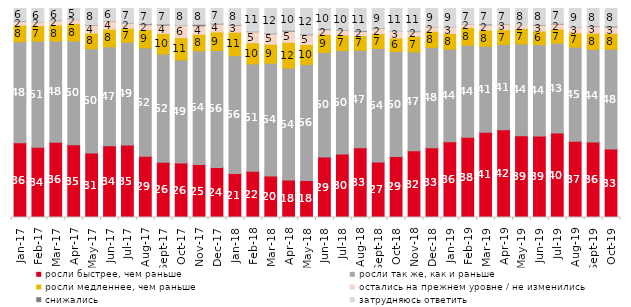
| Category | росли быстрее, чем раньше | росли так же, как и раньше | росли медленнее, чем раньше | остались на прежнем уровне / не изменились | снижались | затрудняюсь ответить |
|---|---|---|---|---|---|---|
| 2017-01-01 | 35.75 | 48.35 | 7.9 | 1.95 | 0.15 | 5.9 |
| 2017-02-01 | 33.65 | 50.75 | 7.45 | 1.8 | 0.1 | 6.25 |
| 2017-03-01 | 36 | 48.45 | 7.65 | 2.1 | 0.2 | 5.6 |
| 2017-04-01 | 34.85 | 49.65 | 8.35 | 1.85 | 0.1 | 5.2 |
| 2017-05-01 | 30.9 | 49.8 | 7.5 | 3.9 | 0.2 | 7.7 |
| 2017-06-01 | 34.3 | 47.4 | 8.4 | 3.95 | 0.15 | 5.8 |
| 2017-07-01 | 34.65 | 49.2 | 6.7 | 2.3 | 0.15 | 7 |
| 2017-08-01 | 29.3 | 51.9 | 8.65 | 2.4 | 0.45 | 7.3 |
| 2017-09-01 | 26.4 | 51.8 | 9.85 | 4 | 0.5 | 7.45 |
| 2017-10-01 | 26.1 | 49.3 | 10.65 | 5.8 | 0.15 | 8 |
| 2017-11-01 | 25.35 | 54.4 | 7.9 | 4.05 | 0.75 | 7.55 |
| 2017-12-01 | 23.95 | 55.95 | 8.9 | 3.8 | 0.3 | 7.1 |
| 2018-01-01 | 21.1 | 56.35 | 11.2 | 3.35 | 0.25 | 7.75 |
| 2018-02-01 | 22.1 | 51.4 | 10.1 | 5.3 | 0.2 | 10.9 |
| 2018-03-01 | 19.8 | 54 | 9.1 | 5.05 | 0.25 | 11.8 |
| 2018-04-01 | 17.95 | 53.55 | 12.3 | 5.35 | 0.45 | 10.4 |
| 2018-05-01 | 17.75 | 55.5 | 9.55 | 4.65 | 0.3 | 12.25 |
| 2018-06-01 | 28.9 | 50.1 | 8.6 | 2.3 | 0.35 | 9.75 |
| 2018-07-01 | 30.35 | 49.6 | 7.35 | 2.4 | 0.15 | 10.15 |
| 2018-08-01 | 33.35 | 46.65 | 7.05 | 2 | 0.35 | 10.6 |
| 2018-09-01 | 26.55 | 54.35 | 7.05 | 2.45 | 0.2 | 9.4 |
| 2018-10-01 | 29.2 | 50.2 | 6.45 | 3.15 | 0.05 | 10.95 |
| 2018-11-01 | 31.886 | 47.355 | 7.435 | 2.246 | 0.299 | 10.778 |
| 2018-12-01 | 33.4 | 48 | 7.7 | 2.1 | 0.05 | 8.75 |
| 2019-01-01 | 36.25 | 44.25 | 7.55 | 2.85 | 0.1 | 9 |
| 2019-02-01 | 38.35 | 44.05 | 8.45 | 1.85 | 0.05 | 7.25 |
| 2019-03-01 | 40.825 | 41.124 | 7.708 | 2.486 | 0.398 | 7.459 |
| 2019-04-01 | 42.03 | 40.792 | 7.079 | 2.723 | 0.149 | 7.228 |
| 2019-05-01 | 39.079 | 43.933 | 7.429 | 1.783 | 0 | 7.776 |
| 2019-06-01 | 39.052 | 43.691 | 6.434 | 2.843 | 0.249 | 7.731 |
| 2019-07-01 | 40.396 | 43.02 | 6.782 | 2.376 | 0.297 | 7.129 |
| 2019-08-01 | 36.513 | 45.005 | 6.843 | 2.547 | 0.1 | 8.991 |
| 2019-09-01 | 36.139 | 44.307 | 7.772 | 3.119 | 0.248 | 8.416 |
| 2019-10-01 | 32.822 | 47.673 | 7.574 | 3.119 | 0.396 | 8.416 |